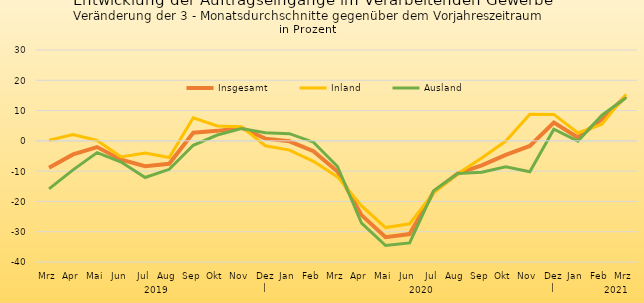
| Category | Insgesamt | Inland | Ausland |
|---|---|---|---|
| Mrz | -8.882 | 0.223 | -15.844 |
| Apr | -4.467 | 2.104 | -9.582 |
| Mai | -2.041 | 0.129 | -3.875 |
| Jun | -6.225 | -5.286 | -7.015 |
| Jul | -8.369 | -4.006 | -12.098 |
| Aug | -7.574 | -5.52 | -9.395 |
| Sep | 2.678 | 7.601 | -1.471 |
| Okt | 3.299 | 4.935 | 1.927 |
| Nov | 4.338 | 4.689 | 4.053 |
| Dez | | 0.724 | -1.607 | 2.714 |
| Jan | -0.139 | -3.047 | 2.376 |
| Feb | -3.427 | -6.766 | -0.441 |
| Mrz | -10.103 | -11.896 | -8.472 |
| Apr | -24.521 | -21.477 | -27.197 |
| Mai | -31.782 | -28.641 | -34.547 |
| Jun | -30.782 | -27.367 | -33.707 |
| Jul | -16.804 | -17.127 | -16.502 |
| Aug | -10.8 | -10.821 | -10.78 |
| Sep | -8.12 | -5.677 | -10.367 |
| Okt | -4.636 | -0.065 | -8.581 |
| Nov | -1.67 | 8.789 | -10.206 |
| Dez | | 6.054 | 8.73 | 3.865 |
| Jan | 1.121 | 2.615 | -0.087 |
| Feb | 7.122 | 5.507 | 8.458 |
| Mrz | 14.747 | 15.33 | 14.212 |